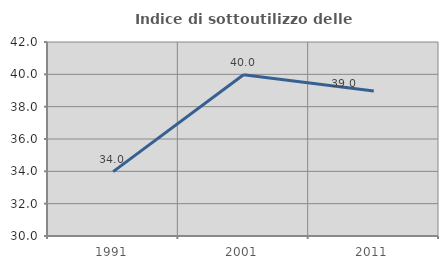
| Category | Indice di sottoutilizzo delle abitazioni  |
|---|---|
| 1991.0 | 33.979 |
| 2001.0 | 39.977 |
| 2011.0 | 38.973 |